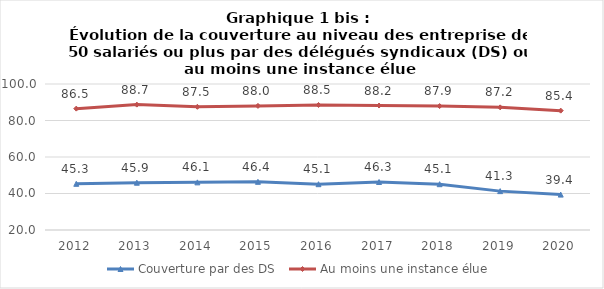
| Category | Couverture par des DS  | Au moins une instance élue  |
|---|---|---|
| 2012.0 | 45.3 | 86.5 |
| 2013.0 | 45.9 | 88.7 |
| 2014.0 | 46.1 | 87.5 |
| 2015.0 | 46.4 | 88 |
| 2016.0 | 45.1 | 88.5 |
| 2017.0 | 46.3 | 88.2 |
| 2018.0 | 45.1 | 87.9 |
| 2019.0 | 41.3 | 87.2 |
| 2020.0 | 39.4 | 85.4 |